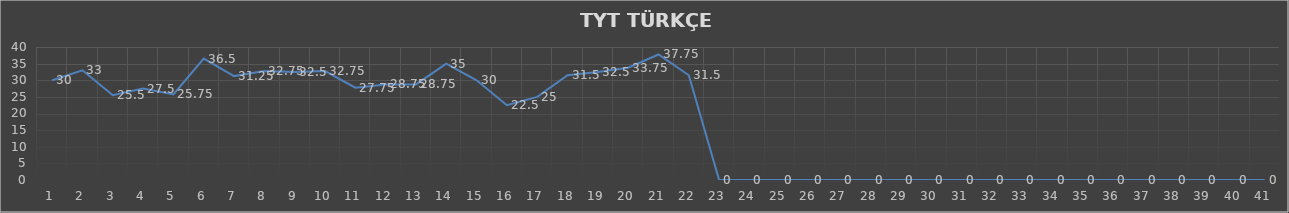
| Category | Series 0 |
|---|---|
| 0 | 30 |
| 1 | 33 |
| 2 | 25.5 |
| 3 | 27.5 |
| 4 | 25.75 |
| 5 | 36.5 |
| 6 | 31.25 |
| 7 | 32.75 |
| 8 | 32.5 |
| 9 | 32.75 |
| 10 | 27.75 |
| 11 | 28.75 |
| 12 | 28.75 |
| 13 | 35 |
| 14 | 30 |
| 15 | 22.5 |
| 16 | 25 |
| 17 | 31.5 |
| 18 | 32.5 |
| 19 | 33.75 |
| 20 | 37.75 |
| 21 | 31.5 |
| 22 | 0 |
| 23 | 0 |
| 24 | 0 |
| 25 | 0 |
| 26 | 0 |
| 27 | 0 |
| 28 | 0 |
| 29 | 0 |
| 30 | 0 |
| 31 | 0 |
| 32 | 0 |
| 33 | 0 |
| 34 | 0 |
| 35 | 0 |
| 36 | 0 |
| 37 | 0 |
| 38 | 0 |
| 39 | 0 |
| 40 | 0 |